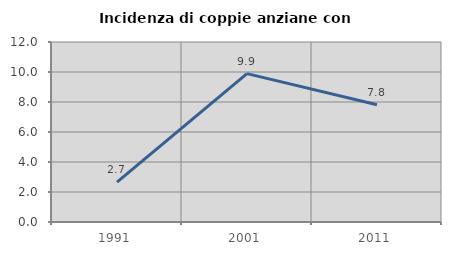
| Category | Incidenza di coppie anziane con figli |
|---|---|
| 1991.0 | 2.655 |
| 2001.0 | 9.89 |
| 2011.0 | 7.812 |